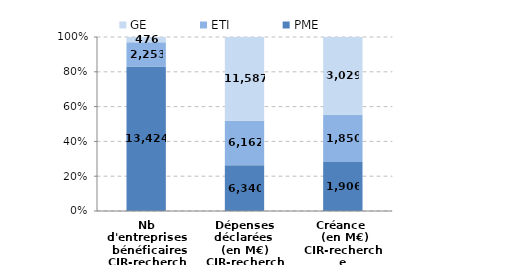
| Category | PME | ETI | GE |
|---|---|---|---|
| Nb d'entreprises
 bénéficaires
CIR-recherche | 13424 | 2253 | 476 |
| Dépenses déclarées 
(en M€)
CIR-recherche | 6340.16 | 6161.84 | 11586.74 |
| Créance 
 (en M€)
CIR-recherche | 1906.14 | 1849.75 | 3029.44 |